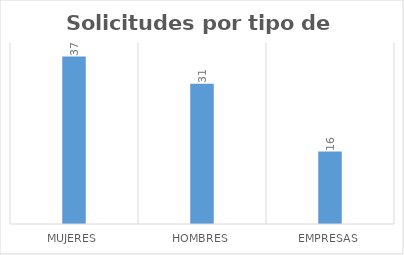
| Category | Series 0 |
|---|---|
| Mujeres  | 37 |
| Hombres  | 31 |
| Empresas  | 16 |